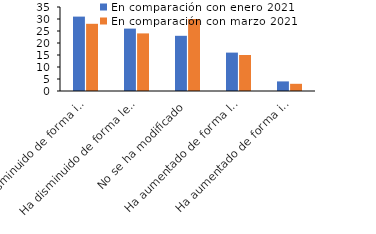
| Category | En comparación con enero 2021 | En comparación con marzo 2021 |
|---|---|---|
| Ha disminuido de forma importante | 31 | 28 |
| Ha disminuido de forma leve | 26 | 24 |
| No se ha modificado | 23 | 30 |
| Ha aumentado de forma leve | 16 | 15 |
| Ha aumentado de forma importante | 4 | 3 |